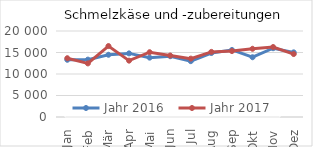
| Category | Jahr 2016 | Jahr 2017 |
|---|---|---|
| Jan | 13307.146 | 13670.735 |
| Feb | 13342.086 | 12462.71 |
| Mär | 14471.323 | 16500.087 |
| Apr | 14793.99 | 13104.812 |
| Mai | 13806.281 | 15064.109 |
| Jun | 14136.032 | 14296.394 |
| Jul | 12985.459 | 13574.079 |
| Aug | 14877.051 | 15142.135 |
| Sep | 15591.447 | 15330.042 |
| Okt | 13897.693 | 15866.316 |
| Nov | 15993.685 | 16273.056 |
| Dez | 15033.32 | 14636.703 |